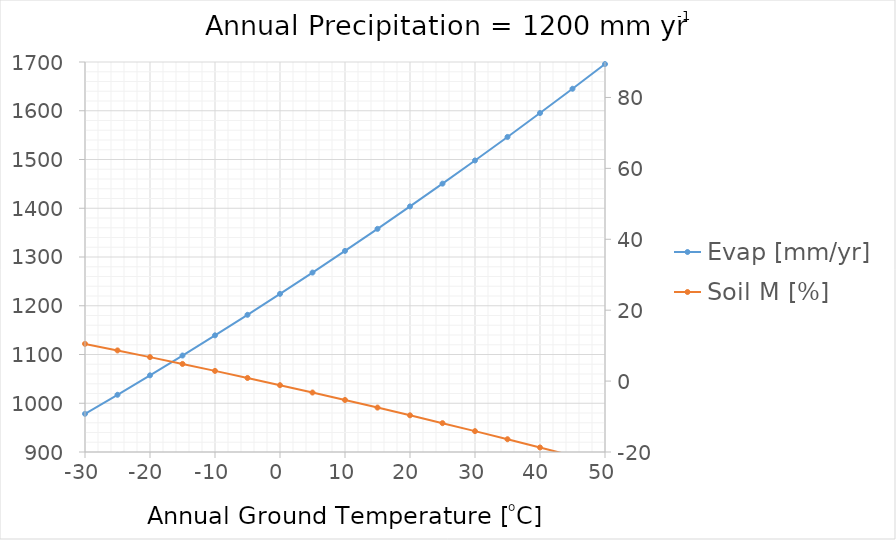
| Category | Evap [mm/yr] |
|---|---|
| -30.0 | 978.288 |
| -25.0 | 1017.389 |
| -20.0 | 1057.254 |
| -15.0 | 1097.885 |
| -10.0 | 1139.28 |
| -5.0 | 1181.441 |
| 0.0 | 1224.366 |
| 5.0 | 1268.057 |
| 10.0 | 1312.512 |
| 15.0 | 1357.733 |
| 20.0 | 1403.718 |
| 25.0 | 1450.468 |
| 30.0 | 1497.984 |
| 35.0 | 1546.264 |
| 40.0 | 1595.31 |
| 45.0 | 1645.12 |
| 50.0 | 1695.696 |